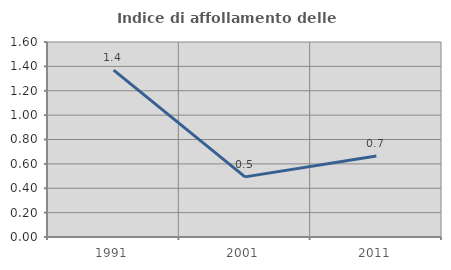
| Category | Indice di affollamento delle abitazioni  |
|---|---|
| 1991.0 | 1.37 |
| 2001.0 | 0.493 |
| 2011.0 | 0.664 |